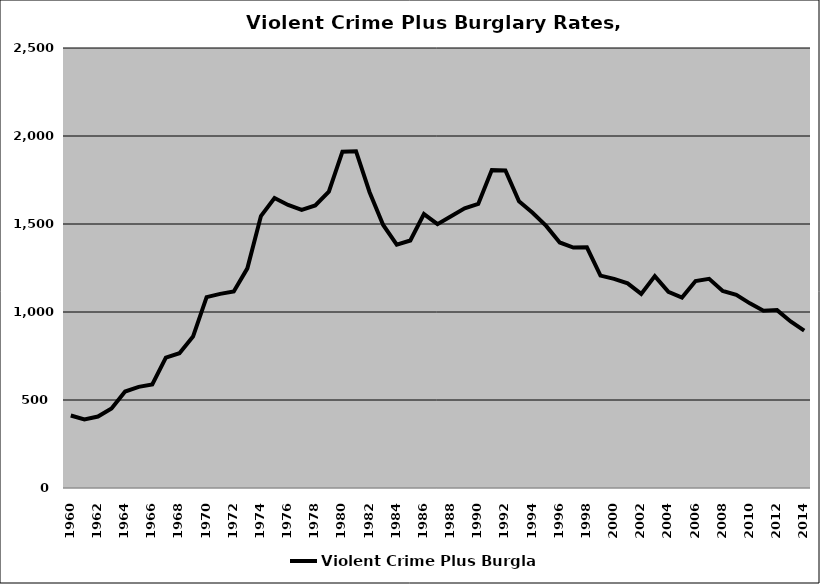
| Category | Violent Crime Plus Burglary |
|---|---|
| 1960.0 | 412.052 |
| 1961.0 | 390.018 |
| 1962.0 | 405.949 |
| 1963.0 | 452.36 |
| 1964.0 | 548.27 |
| 1965.0 | 574.53 |
| 1966.0 | 587.956 |
| 1967.0 | 741.011 |
| 1968.0 | 766.001 |
| 1969.0 | 860.146 |
| 1970.0 | 1084.448 |
| 1971.0 | 1103.056 |
| 1972.0 | 1116.43 |
| 1973.0 | 1247.96 |
| 1974.0 | 1544.89 |
| 1975.0 | 1647.728 |
| 1976.0 | 1608.095 |
| 1977.0 | 1580.181 |
| 1978.0 | 1605.026 |
| 1979.0 | 1683.411 |
| 1980.0 | 1910.749 |
| 1981.0 | 1913.65 |
| 1982.0 | 1680.648 |
| 1983.0 | 1494.309 |
| 1984.0 | 1383.265 |
| 1985.0 | 1406.367 |
| 1986.0 | 1556.481 |
| 1987.0 | 1498.748 |
| 1988.0 | 1544.19 |
| 1989.0 | 1589.495 |
| 1990.0 | 1614.24 |
| 1991.0 | 1806.253 |
| 1992.0 | 1804.479 |
| 1993.0 | 1628.566 |
| 1994.0 | 1564.174 |
| 1995.0 | 1489.123 |
| 1996.0 | 1395.062 |
| 1997.0 | 1365.819 |
| 1998.0 | 1367.668 |
| 1999.0 | 1206.947 |
| 2000.0 | 1188.58 |
| 2001.0 | 1162.9 |
| 2002.0 | 1102.896 |
| 2003.0 | 1203.911 |
| 2004.0 | 1114.827 |
| 2005.0 | 1081.774 |
| 2006.0 | 1175.909 |
| 2007.0 | 1188.366 |
| 2008.0 | 1119.943 |
| 2009.0 | 1097.402 |
| 2010.0 | 1049.203 |
| 2011.0 | 1007.565 |
| 2012.0 | 1010.814 |
| 2013.0 | 946.336 |
| 2014.0 | 893.623 |